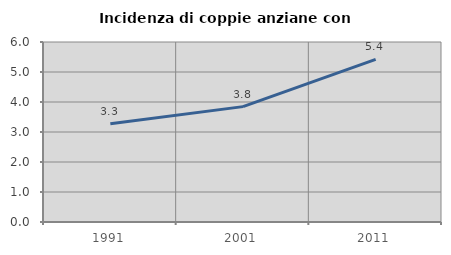
| Category | Incidenza di coppie anziane con figli |
|---|---|
| 1991.0 | 3.274 |
| 2001.0 | 3.846 |
| 2011.0 | 5.421 |